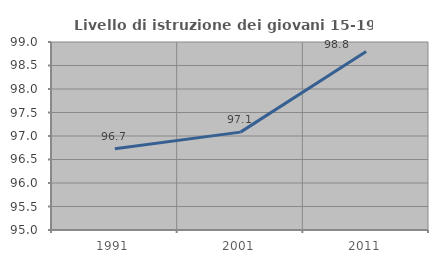
| Category | Livello di istruzione dei giovani 15-19 anni |
|---|---|
| 1991.0 | 96.731 |
| 2001.0 | 97.082 |
| 2011.0 | 98.798 |